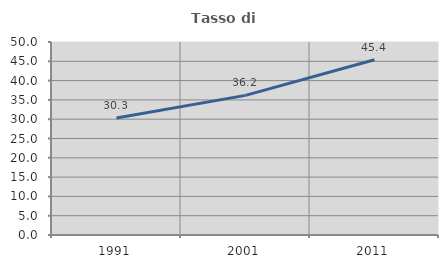
| Category | Tasso di occupazione   |
|---|---|
| 1991.0 | 30.307 |
| 2001.0 | 36.174 |
| 2011.0 | 45.391 |